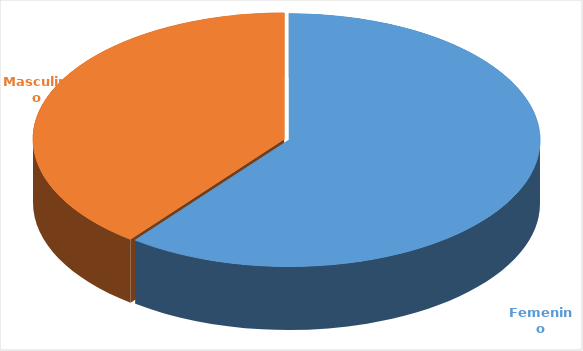
| Category | Cantidad  |
|---|---|
| Femenino | 3801 |
| Masculino | 2485 |